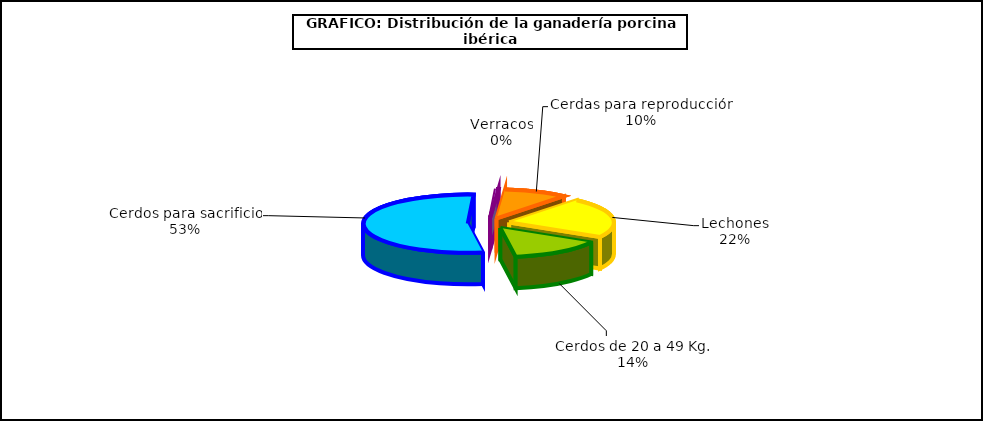
| Category | año 2014 |
|---|---|
| 0 | 729756.01 |
| 1 | 472123.061 |
| 2 | 1749395.249 |
| 3 | 12970.053 |
| 4 | 322846.914 |